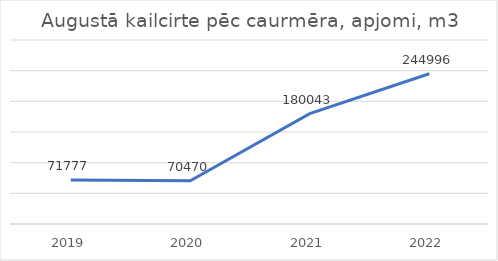
| Category | Augustā kailcirte pēc caurmēra, apjomi, m3 |
|---|---|
| 2019.0 | 71777 |
| 2020.0 | 70470 |
| 2021.0 | 180043 |
| 2022.0 | 244996 |